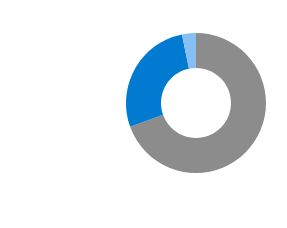
| Category | Series 0 |
|---|---|
| 0 | 69.516 |
| 1 | 27.27 |
| 2 | 3.214 |